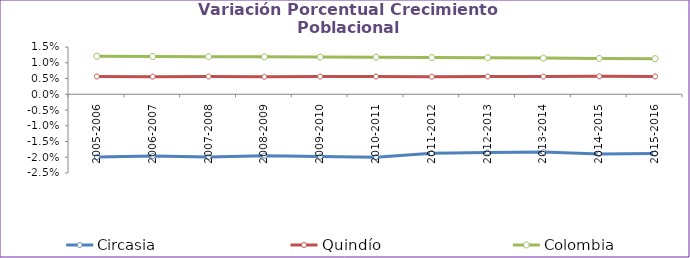
| Category | Circasia | Quindío | Colombia |
|---|---|---|---|
| 2005-2006 | -0.02 | 0.006 | 0.012 |
| 2006-2007 | -0.02 | 0.006 | 0.012 |
| 2007-2008 | -0.02 | 0.006 | 0.012 |
| 2008-2009 | -0.02 | 0.006 | 0.012 |
| 2009-2010 | -0.02 | 0.006 | 0.012 |
| 2010-2011 | -0.02 | 0.006 | 0.012 |
| 2011-2012 | -0.019 | 0.006 | 0.012 |
| 2012-2013 | -0.018 | 0.006 | 0.012 |
| 2013-2014 | -0.018 | 0.006 | 0.011 |
| 2014-2015 | -0.019 | 0.006 | 0.011 |
| 2015-2016 | -0.019 | 0.006 | 0.011 |